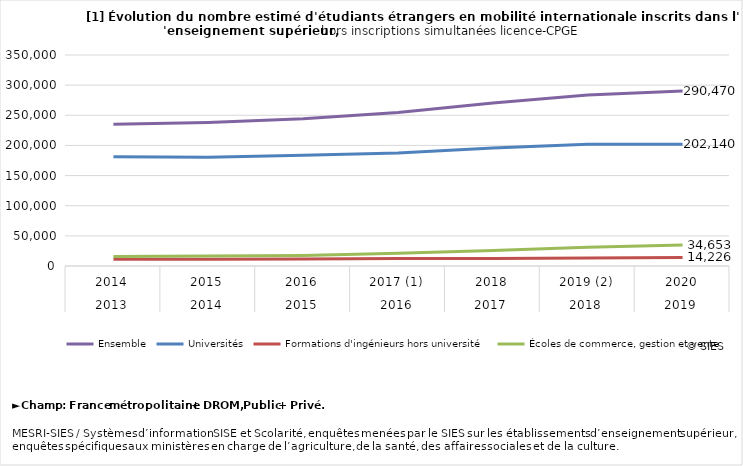
| Category | Ensemble | Universités | Formations d'ingénieurs hors université  | Écoles de commerce, gestion et vente |
|---|---|---|---|---|
| 0 | 235149 | 181040 | 11080 | 15661 |
| 1 | 238179 | 180506 | 11207 | 16423 |
| 2 | 244078 | 183869 | 11592 | 17476 |
| 3 | 254738 | 187642 | 12634 | 21276 |
| 4 | 270463 | 195600 | 12371 | 25860 |
| 5 | 283714 | 202151 | 13379 | 30907 |
| 6 | 290470 | 202140 | 14226 | 34653 |